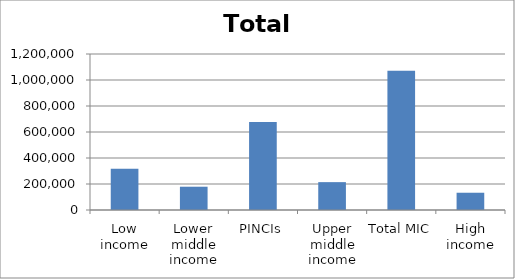
| Category | Series 0 |
|---|---|
| Low income | 317555.701 |
| Lower middle income | 179105.836 |
| PINCIs | 677136.006 |
| Upper middle income | 214331.337 |
| Total MIC | 1070573.179 |
| High income | 132800.239 |